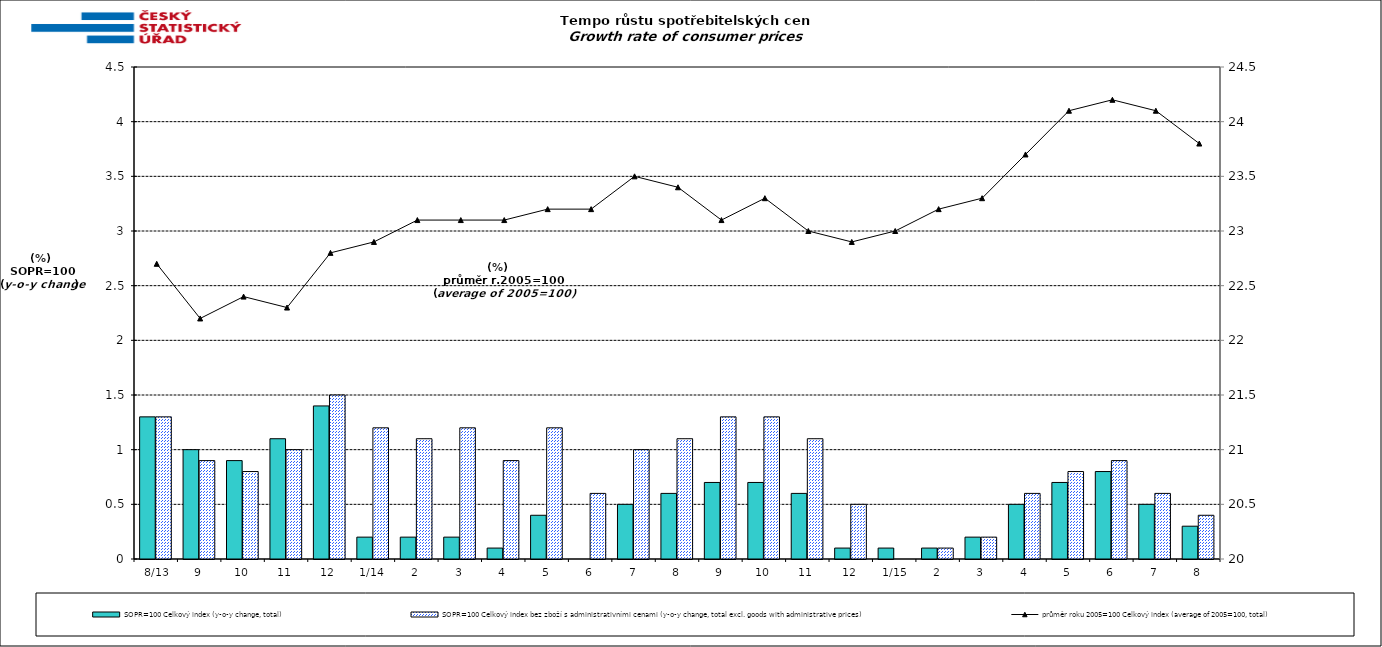
| Category | SOPR=100 Celkový index (y-o-y change, total) | SOPR=100 Celkový index bez zboží s administrativními cenami (y-o-y change, total excl. goods with administrative prices)  |
|---|---|---|
|  8/13 | 1.3 | 1.3 |
| 9 | 1 | 0.9 |
| 10 | 0.9 | 0.8 |
| 11 | 1.1 | 1 |
| 12 | 1.4 | 1.5 |
| 1/14 | 0.2 | 1.2 |
| 2 | 0.2 | 1.1 |
| 3 | 0.2 | 1.2 |
| 4 | 0.1 | 0.9 |
| 5 | 0.4 | 1.2 |
| 6 | 0 | 0.6 |
| 7 | 0.5 | 1 |
| 8 | 0.6 | 1.1 |
| 9 | 0.7 | 1.3 |
| 10 | 0.7 | 1.3 |
| 11 | 0.6 | 1.1 |
| 12 | 0.1 | 0.5 |
|  1/15 | 0.1 | 0 |
| 2 | 0.1 | 0.1 |
| 3 | 0.2 | 0.2 |
| 4 | 0.5 | 0.6 |
| 5 | 0.7 | 0.8 |
| 6 | 0.8 | 0.9 |
| 7 | 0.5 | 0.6 |
| 8 | 0.3 | 0.4 |